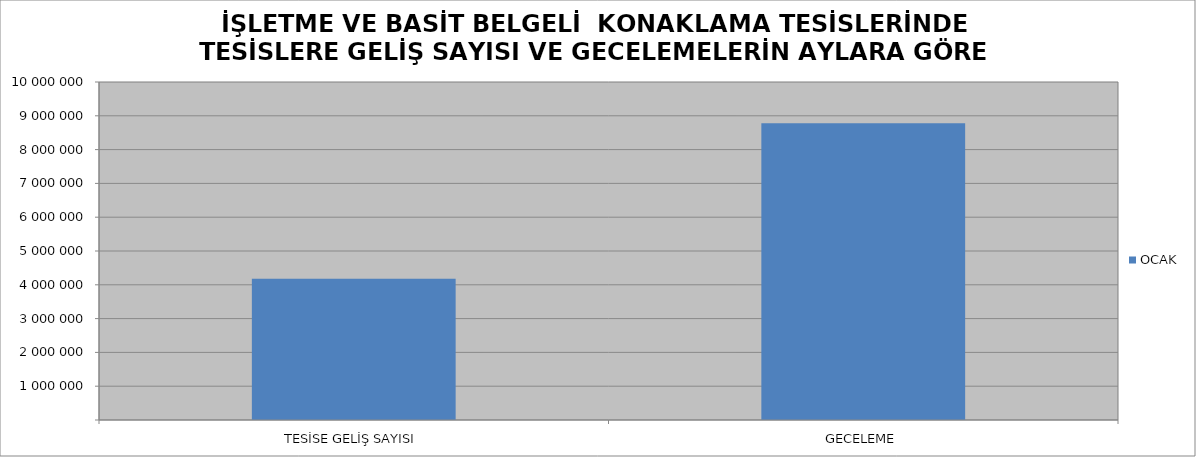
| Category | OCAK |
|---|---|
| TESİSE GELİŞ SAYISI | 4176369 |
| GECELEME | 8783046 |